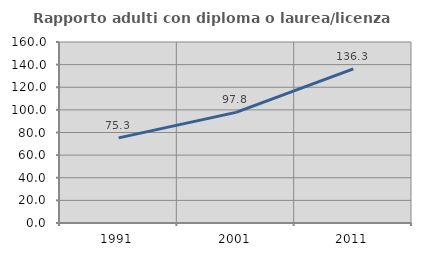
| Category | Rapporto adulti con diploma o laurea/licenza media  |
|---|---|
| 1991.0 | 75.274 |
| 2001.0 | 97.792 |
| 2011.0 | 136.32 |